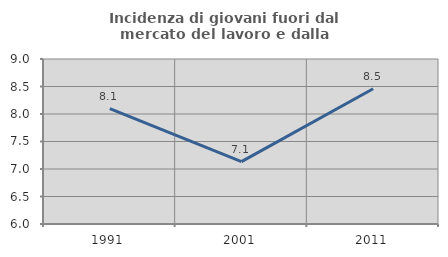
| Category | Incidenza di giovani fuori dal mercato del lavoro e dalla formazione  |
|---|---|
| 1991.0 | 8.099 |
| 2001.0 | 7.133 |
| 2011.0 | 8.459 |